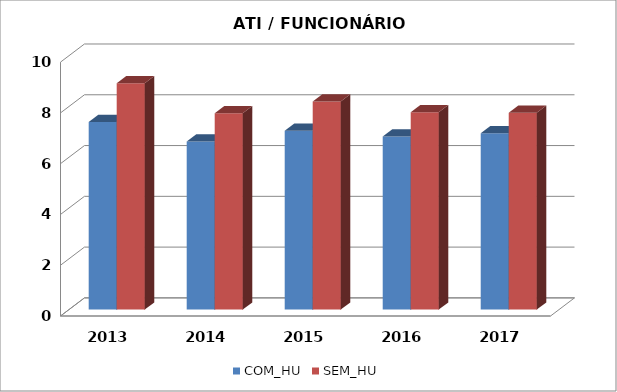
| Category | COM_HU | SEM_HU |
|---|---|---|
| 2013.0 | 7.393 | 8.918 |
| 2014.0 | 6.622 | 7.738 |
| 2015.0 | 7.043 | 8.196 |
| 2016.0 | 6.82 | 7.77 |
| 2017.0 | 6.945 | 7.756 |